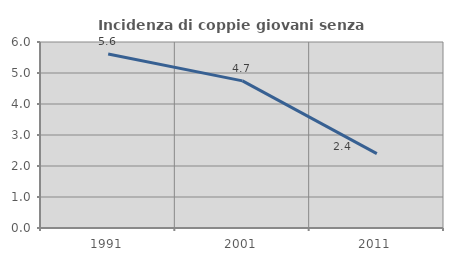
| Category | Incidenza di coppie giovani senza figli |
|---|---|
| 1991.0 | 5.614 |
| 2001.0 | 4.746 |
| 2011.0 | 2.397 |